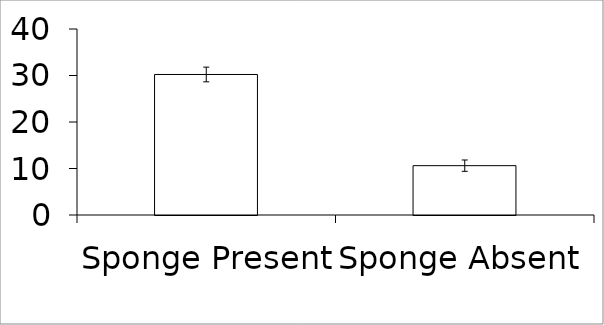
| Category | Series 0 |
|---|---|
| Sponge Present | 30.22 |
| Sponge Absent | 10.61 |